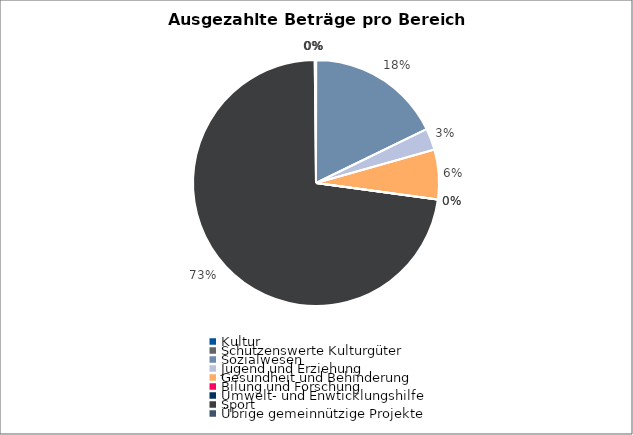
| Category | Series 0 |
|---|---|
| Kultur | 900 |
| Schützenswerte Kulturgüter | 0 |
| Sozialwesen | 1736379 |
| Jugend und Erziehung | 278000 |
| Gesundheit und Behinderung | 637900 |
| Bilung und Forschung | 0 |
| Umwelt- und Enwticklungshilfe | 0 |
| Sport | 7103150 |
| Übrige gemeinnützige Projekte | 16800 |